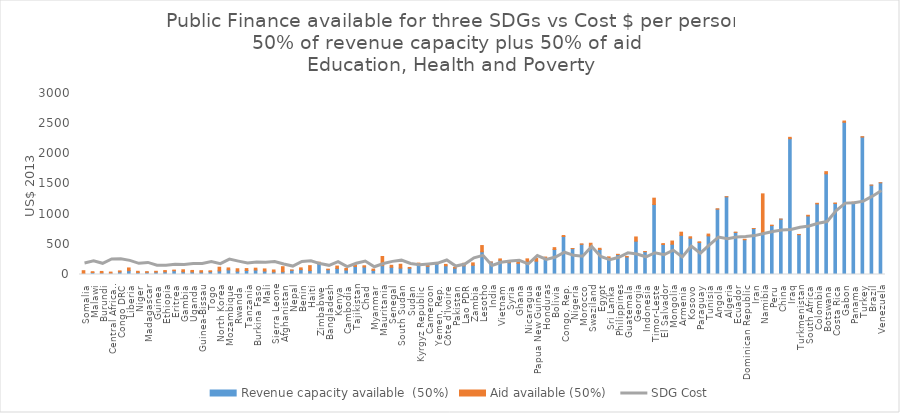
| Category | Revenue capacity available  (50%) | Aid available (50%)  |
|---|---|---|
| Somalia | 11.584 | 51.435 |
| Malawi | 33.651 | 12.66 |
| Burundi | 25.88 | 24.997 |
| Central African Republic | 21.2 | 18.828 |
| Congo DRC | 42.995 | 16.856 |
| Liberia | 63.559 | 45.045 |
| Niger | 34.213 | 18.823 |
| Madagascar | 35.996 | 10.887 |
| Guinea | 40.478 | 12.684 |
| Ethiopia | 44.802 | 20.475 |
| Eritrea | 62.374 | 10.792 |
| Gambia | 45.381 | 32.601 |
| Uganda | 42.941 | 24.18 |
| Guinea-Bissau | 40.544 | 22.803 |
| Togo | 46.038 | 15.082 |
| North Korea | 59.821 | 60.844 |
| Mozambique | 77.131 | 31.732 |
| Rwanda | 55.734 | 39.489 |
| Tanzania | 66.424 | 31.604 |
| Burkina Faso | 73.885 | 30.734 |
| Mali | 56.946 | 35.655 |
| Sierra Leone | 43.104 | 31.815 |
| Afghanistan | 45.044 | 84.021 |
| Nepal | 69.29 | 6.347 |
| Benin | 80.449 | 29.318 |
| Haiti | 64.242 | 82.366 |
| Zimbabwe | 176.011 | 28.307 |
| Bangladesh | 79.041 | 9.728 |
| Kenya | 101.619 | 38.282 |
| Cambodia | 74.389 | 26.391 |
| Tajikistan | 132.594 | 25.771 |
| Chad | 124.022 | 20.531 |
| Myanmar | 67.62 | 22.31 |
| Mauritania | 146.237 | 152.397 |
| Senegal | 119.999 | 32.346 |
| South Sudan | 106.005 | 63.699 |
| Sudan | 104.219 | 12.533 |
| Kyrgyz Republic | 150.675 | 38.16 |
| Cameroon | 135.259 | 17.596 |
| Yemen, Rep. | 175.071 | 17.607 |
| Côte d'Ivoire | 143.837 | 23.742 |
| Pakistan | 105.885 | 11.093 |
| Lao PDR | 144.098 | 41.561 |
| Zambia | 153.176 | 39.542 |
| Lesotho | 376.641 | 103.182 |
| India | 205 | 1.853 |
| Vietnam | 235.073 | 23.227 |
| Syria | 194.598 | 19.7 |
| Ghana | 185.819 | 27.831 |
| Nicaragua | 173.995 | 85.116 |
| Papua New Guinea | 220.454 | 45.659 |
| Honduras | 259.363 | 29.638 |
| Bolivia | 414.301 | 30.688 |
| Congo, Rep. | 629.905 | 16.006 |
| Nigeria | 429.267 | 1.937 |
| Morocco | 500.022 | 7.324 |
| Swaziland | 466.634 | 51.271 |
| Egypt | 415.383 | 19.047 |
| Sri Lanka | 269.502 | 22.76 |
| Philippines | 329.8 | 4.724 |
| Guatemala | 290.062 | 9.151 |
| Georgia | 552.348 | 69.757 |
| Indonesia | 377.202 | 4.18 |
| Timor-Leste | 1160.731 | 104.41 |
| El Salvador | 497.073 | 15.036 |
| Mongolia | 501.485 | 53.251 |
| Armenia | 649.109 | 52.222 |
| Kosovo | 602.507 | 22.561 |
| Paraguay | 531.159 | 10.207 |
| Tunisia | 640.399 | 29.62 |
| Angola | 1082.765 | 6.268 |
| Algeria | 1287.578 | 1.694 |
| Ecuador | 697.601 | 4.42 |
| Dominican Republic | 575.784 | 8.473 |
| Iran | 762.45 | 0.414 |
| Namibia | 681.931 | 654.528 |
| Peru | 811.23 | 6.698 |
| China | 917.947 | 0.518 |
| Iraq | 2251.276 | 22.294 |
| Turkmenistan | 660.323 | 3.351 |
| South Africa | 970.208 | 11.45 |
| Colombia | 1170.747 | 9.525 |
| Botswana | 1668.697 | 35.726 |
| Costa Rica | 1177.864 | 6.626 |
| Gabon | 2522.917 | 20.834 |
| Panama | 1194.034 | 5.324 |
| Turkey | 2277.506 | 6.667 |
| Brazil | 1480.174 | 2.008 |
| Venezuela | 1519.818 | 0.473 |